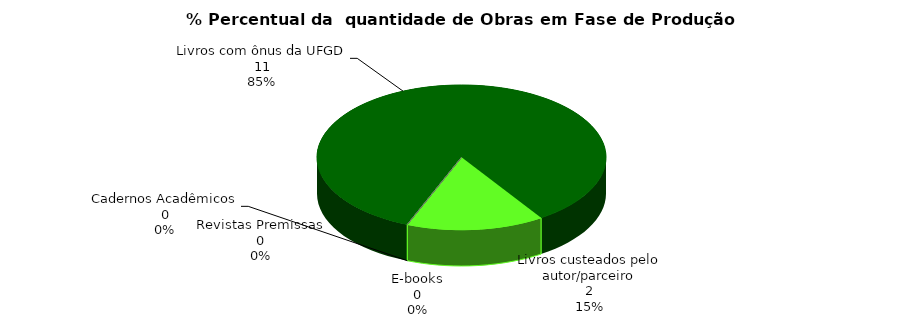
| Category | Series 0 |
|---|---|
| 0 | 11 |
| 1 | 2 |
| 2 | 0 |
| 3 | 0 |
| 4 | 0 |